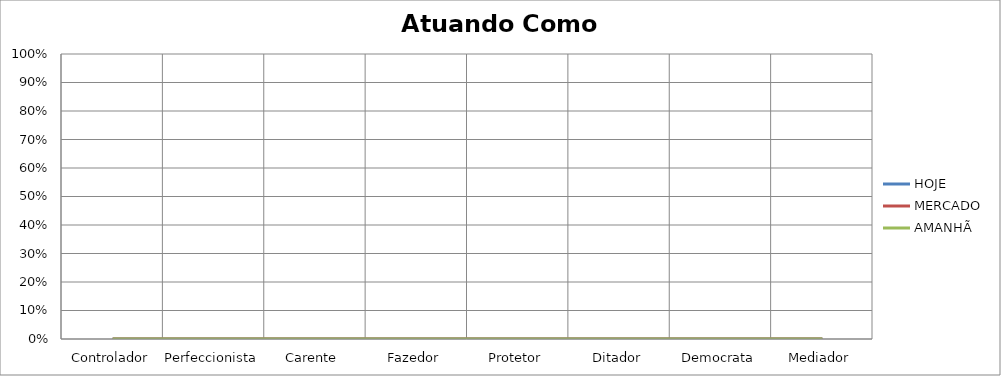
| Category | HOJE | MERCADO | AMANHÃ |
|---|---|---|---|
| Controlador | 0 | 0 | 0 |
| Perfeccionista | 0 | 0 | 0 |
| Carente | 0 | 0 | 0 |
| Fazedor | 0 | 0 | 0 |
| Protetor | 0 | 0 | 0 |
| Ditador | 0 | 0 | 0 |
| Democrata | 0 | 0 | 0 |
| Mediador | 0 | 0 | 0 |